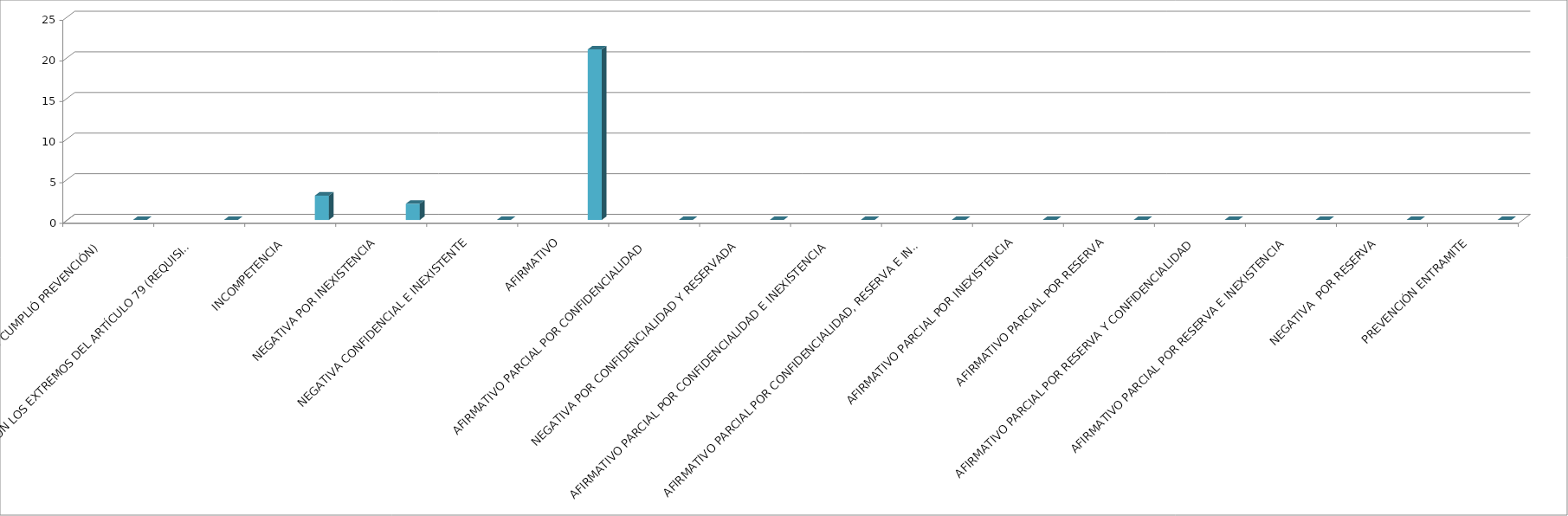
| Category | Series 0 | Series 1 | Series 2 | Series 3 | Series 4 |
|---|---|---|---|---|---|
| SE TIENE POR NO PRESENTADA ( NO CUMPLIÓ PREVENCIÓN) |  |  |  |  | 0 |
| NO CUMPLIO CON LOS EXTREMOS DEL ARTÍCULO 79 (REQUISITOS) |  |  |  |  | 0 |
| INCOMPETENCIA  |  |  |  |  | 3 |
| NEGATIVA POR INEXISTENCIA |  |  |  |  | 2 |
| NEGATIVA CONFIDENCIAL E INEXISTENTE |  |  |  |  | 0 |
| AFIRMATIVO |  |  |  |  | 21 |
| AFIRMATIVO PARCIAL POR CONFIDENCIALIDAD  |  |  |  |  | 0 |
| NEGATIVA POR CONFIDENCIALIDAD Y RESERVADA |  |  |  |  | 0 |
| AFIRMATIVO PARCIAL POR CONFIDENCIALIDAD E INEXISTENCIA |  |  |  |  | 0 |
| AFIRMATIVO PARCIAL POR CONFIDENCIALIDAD, RESERVA E INEXISTENCIA |  |  |  |  | 0 |
| AFIRMATIVO PARCIAL POR INEXISTENCIA |  |  |  |  | 0 |
| AFIRMATIVO PARCIAL POR RESERVA |  |  |  |  | 0 |
| AFIRMATIVO PARCIAL POR RESERVA Y CONFIDENCIALIDAD |  |  |  |  | 0 |
| AFIRMATIVO PARCIAL POR RESERVA E INEXISTENCIA |  |  |  |  | 0 |
| NEGATIVA  POR RESERVA |  |  |  |  | 0 |
| PREVENCIÓN ENTRAMITE |  |  |  |  | 0 |